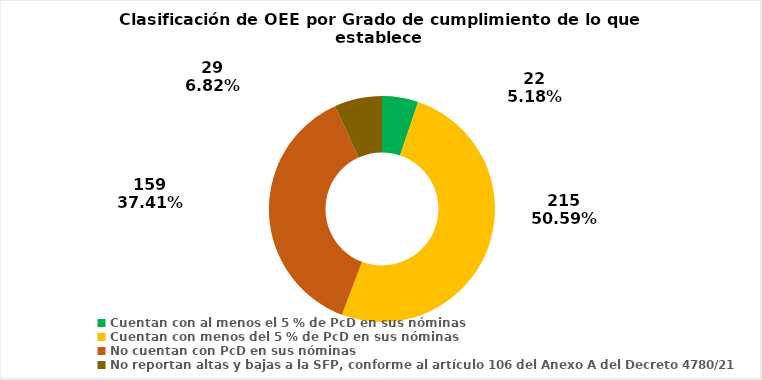
| Category | Series 0 |
|---|---|
| Cuentan con al menos el 5 % de PcD en sus nóminas | 22 |
| Cuentan con menos del 5 % de PcD en sus nóminas | 215 |
| No cuentan con PcD en sus nóminas | 159 |
| No reportan altas y bajas a la SFP, conforme al artículo 106 del Anexo A del Decreto 4780/21 | 29 |